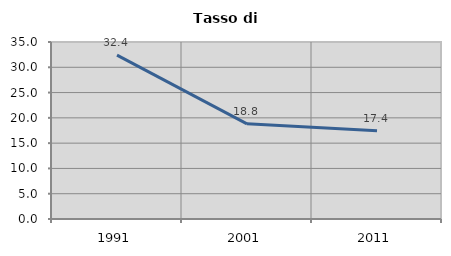
| Category | Tasso di disoccupazione   |
|---|---|
| 1991.0 | 32.416 |
| 2001.0 | 18.815 |
| 2011.0 | 17.436 |